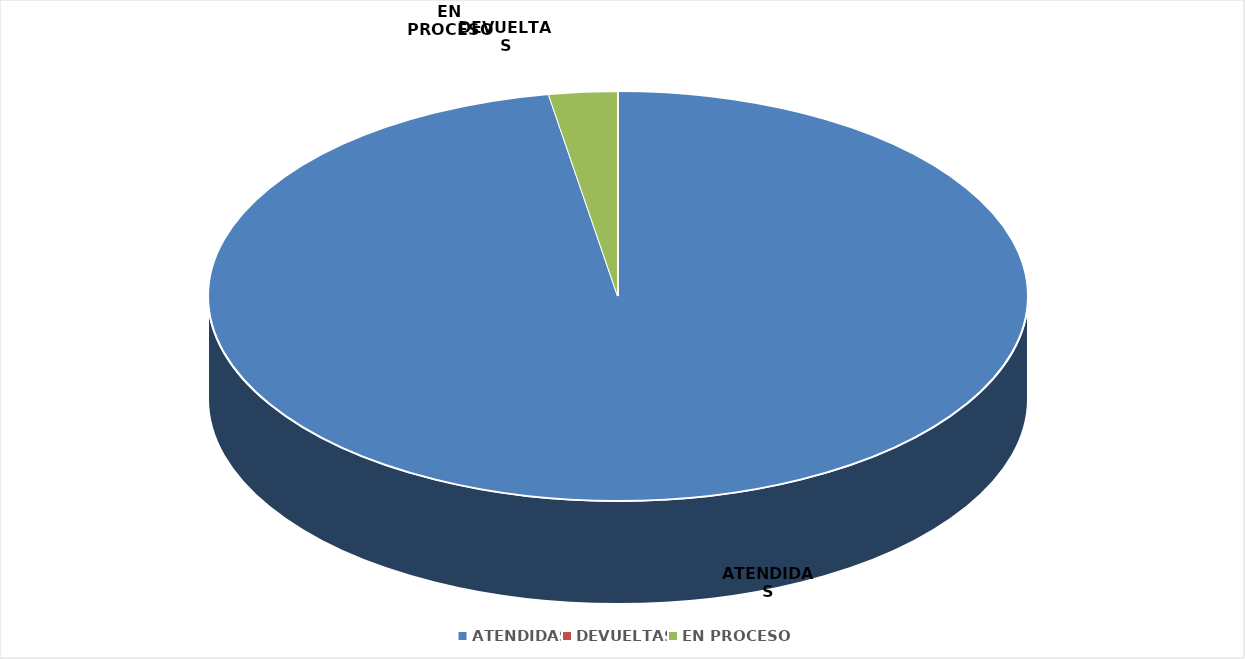
| Category | TOTAL |
|---|---|
| ATENDIDAS | 36 |
| DEVUELTAS | 0 |
| EN PROCESO | 1 |